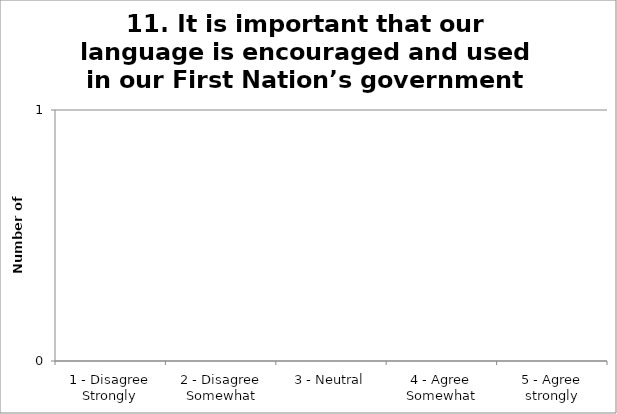
| Category | 11. It is important that our language is encouraged and used in our First Nation’s government activities |
|---|---|
| 1 - Disagree Strongly | 0 |
| 2 - Disagree Somewhat | 0 |
| 3 - Neutral | 0 |
| 4 - Agree Somewhat | 0 |
| 5 - Agree strongly | 0 |